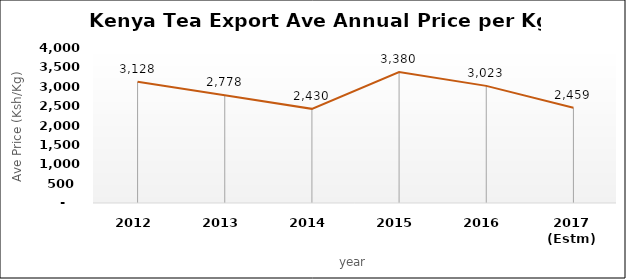
| Category | Ave Price per Kg (Ksh) |
|---|---|
| 2012 | 3128.164 |
| 2013 | 2778.378 |
| 2014 | 2429.562 |
| 2015 | 3380.239 |
| 2016 | 3022.972 |
| 2017 (Estm) | 2458.635 |